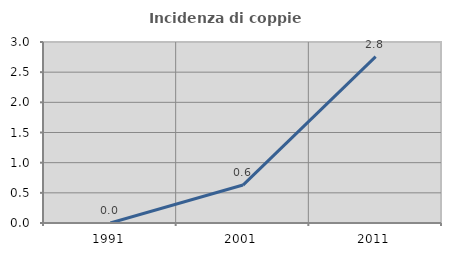
| Category | Incidenza di coppie miste |
|---|---|
| 1991.0 | 0 |
| 2001.0 | 0.629 |
| 2011.0 | 2.759 |